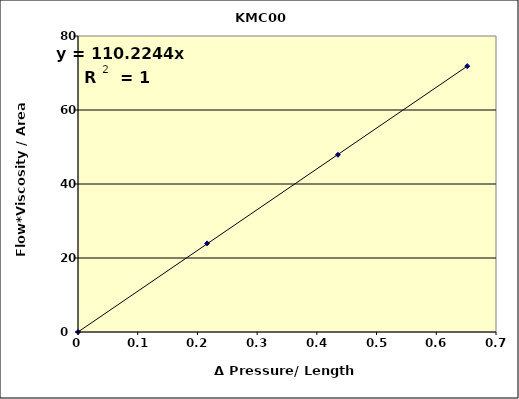
| Category | Series 0 |
|---|---|
| 0.0 | 0 |
| 0.21617877303824445 | 23.952 |
| 0.4353003476765487 | 47.904 |
| 0.6518050020561518 | 71.855 |